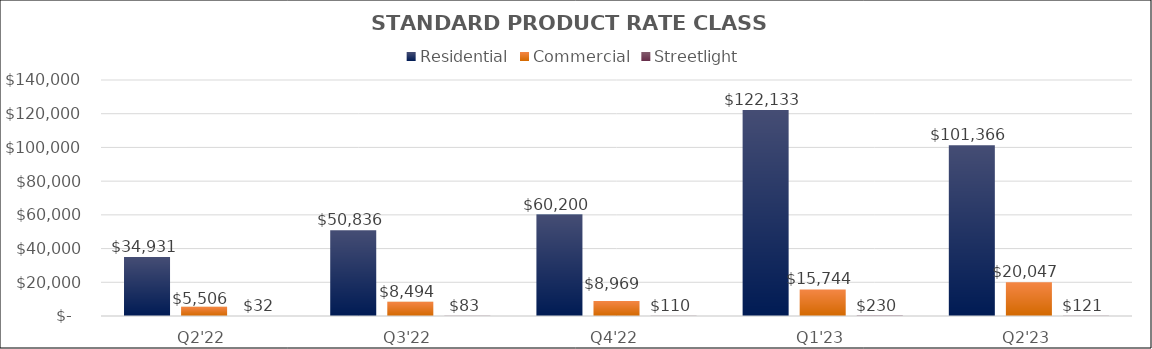
| Category | Residential | Commercial | Streetlight |
|---|---|---|---|
| Q2'22 | 34930.937 | 5506.476 | 31.67 |
| Q3'22 | 50835.505 | 8494.17 | 83.495 |
| Q4'22 | 60199.765 | 8969.257 | 109.711 |
| Q1'23 | 122133.298 | 15743.945 | 229.88 |
| Q2'23 | 101365.531 | 20047.374 | 121.03 |